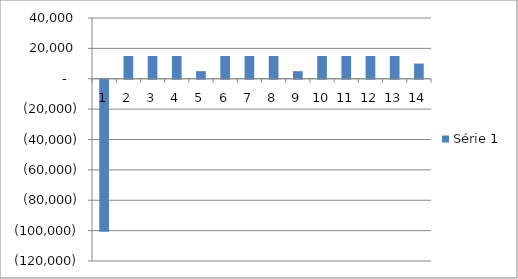
| Category | Série 1 |
|---|---|
| 0 | -100000 |
| 1 | 15000 |
| 2 | 15000 |
| 3 | 15000 |
| 4 | 5000 |
| 5 | 15000 |
| 6 | 15000 |
| 7 | 15000 |
| 8 | 5000 |
| 9 | 15000 |
| 10 | 15000 |
| 11 | 15000 |
| 12 | 15000 |
| 13 | 10000 |